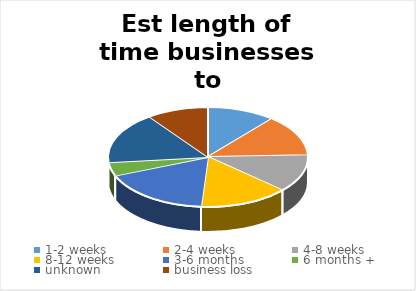
| Category | Series 0 |
|---|---|
| 1-2 weeks | 10 |
| 2-4 weeks  | 12 |
| 4-8 weeks | 11 |
| 8-12 weeks | 13 |
| 3-6 months  | 16 |
| 6 months + | 4 |
| unknown  | 15 |
| business loss  | 9 |